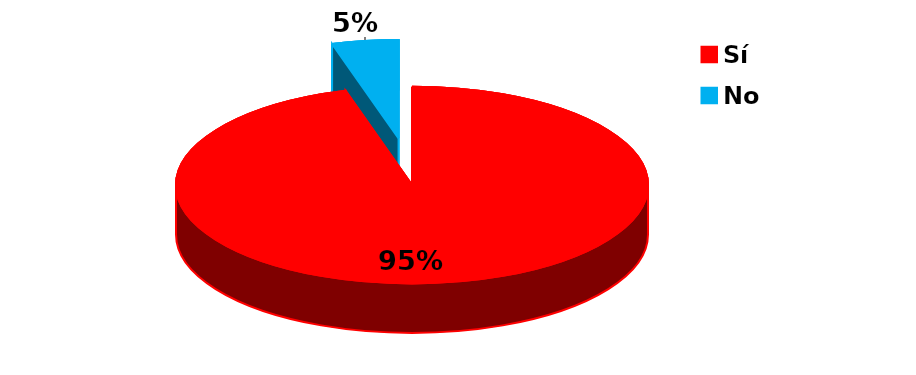
| Category | Series 0 |
|---|---|
| Sí | 21 |
| No | 1 |